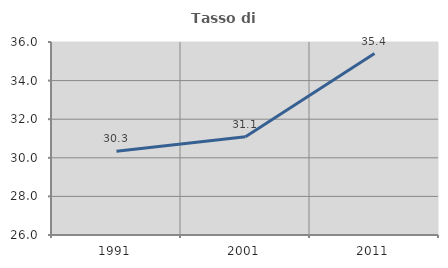
| Category | Tasso di occupazione   |
|---|---|
| 1991.0 | 30.337 |
| 2001.0 | 31.093 |
| 2011.0 | 35.398 |